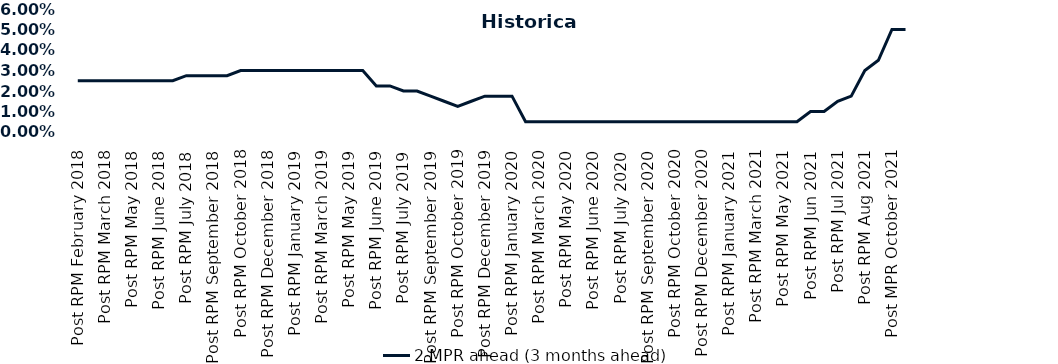
| Category | 2 MPR ahead (3 months ahead) |
|---|---|
| Post RPM February 2018 | 0.025 |
| Pre RPM March 2018 | 0.025 |
| Post RPM March 2018 | 0.025 |
| Pre RPM May 2018 | 0.025 |
| Post RPM May 2018 | 0.025 |
| Pre RPM June 2018 | 0.025 |
| Post RPM June 2018 | 0.025 |
| Pre RPM July 2018 | 0.025 |
| Post RPM July 2018 | 0.028 |
| Pre RPM September 2018 | 0.028 |
| Post RPM September 2018 | 0.028 |
| Pre RPM October 2018 | 0.028 |
| Post RPM October 2018 | 0.03 |
| Pre RPM December 2018 | 0.03 |
| Post RPM December 2018 | 0.03 |
| Pre RPM January 2019 | 0.03 |
| Post RPM January 2019 | 0.03 |
| Pre RPM March 2019 | 0.03 |
| Post RPM March 2019 | 0.03 |
| Pre RPM May 2019 | 0.03 |
| Post RPM May 2019 | 0.03 |
| Pre RPM June 2019 | 0.03 |
| Post RPM June 2019 | 0.022 |
| Pre RPM July 2019 | 0.022 |
| Post RPM July 2019 | 0.02 |
| Pre RPM September 2019 | 0.02 |
| Post RPM September 2019 | 0.018 |
| Pre RPM October 2019 | 0.015 |
| Post RPM October 2019 | 0.012 |
| Pre RPM December 2019 | 0.015 |
| Post RPM December 2019 | 0.018 |
| Pre RPM January 2020 | 0.018 |
| Post RPM January 2020 | 0.018 |
| Pre RPM March 2020 | 0.005 |
| Post RPM March 2020 | 0.005 |
| Pre RPM May 2020 | 0.005 |
| Post RPM May 2020 | 0.005 |
| Pre RPM June 2020 | 0.005 |
| Post RPM June 2020 | 0.005 |
| Pre RPM July 2020 | 0.005 |
| Post RPM July 2020 | 0.005 |
| Pre RPM September 2020 | 0.005 |
| Post RPM September 2020 | 0.005 |
| Pre RPM October 2020 | 0.005 |
| Post RPM October 2020 | 0.005 |
| Pre RPM December 2020 | 0.005 |
|  Post RPM December 2020 | 0.005 |
| Pre RPM January 2021 | 0.005 |
| Post RPM January 2021 | 0.005 |
|  Pre RPM March 2021 | 0.005 |
|  Post RPM March 2021 | 0.005 |
|  Pre RPM May 2021 | 0.005 |
|  Post RPM May 2021 | 0.005 |
|  Pre RPM Jun 2021 | 0.005 |
|   Post RPM Jun 2021 | 0.01 |
| Pre RPM Jul 2021 | 0.01 |
|  Post RPM Jul 2021 | 0.015 |
| Pre RPM Aug 2021 | 0.018 |
|  Post RPM Aug 2021 | 0.03 |
| Pre MPR October 2021 | 0.035 |
| Post MPR October 2021 | 0.05 |
| Pre MPR December 2021 | 0.05 |